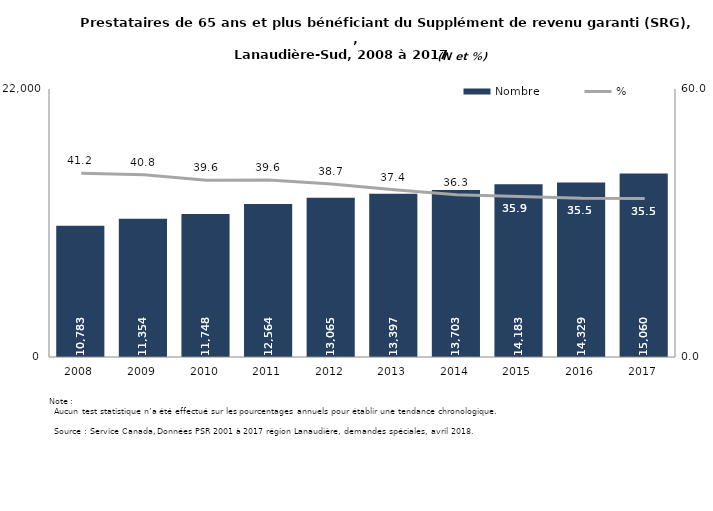
| Category | Nombre |
|---|---|
| 2008.0 | 10783 |
| 2009.0 | 11354 |
| 2010.0 | 11748 |
| 2011.0 | 12564 |
| 2012.0 | 13065 |
| 2013.0 | 13397 |
| 2014.0 | 13703 |
| 2015.0 | 14183 |
| 2016.0 | 14329 |
| 2017.0 | 15060 |